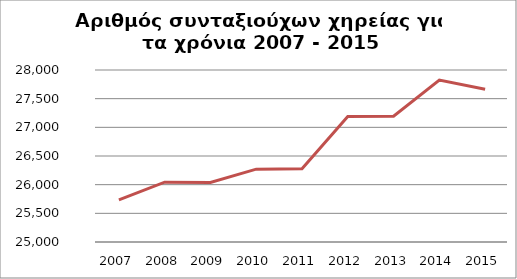
| Category | Series 1 |
|---|---|
| 2007.0 | 25735 |
| 2008.0 | 26043 |
| 2009.0 | 26039 |
| 2010.0 | 26271 |
| 2011.0 | 26279 |
| 2012.0 | 27190 |
| 2013.0 | 27194 |
| 2014.0 | 27824 |
| 2015.0 | 27663 |